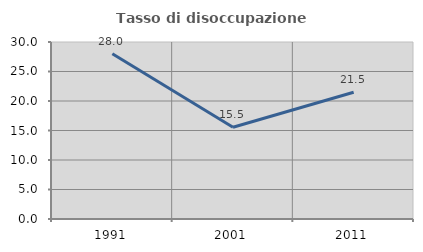
| Category | Tasso di disoccupazione giovanile  |
|---|---|
| 1991.0 | 28 |
| 2001.0 | 15.546 |
| 2011.0 | 21.488 |